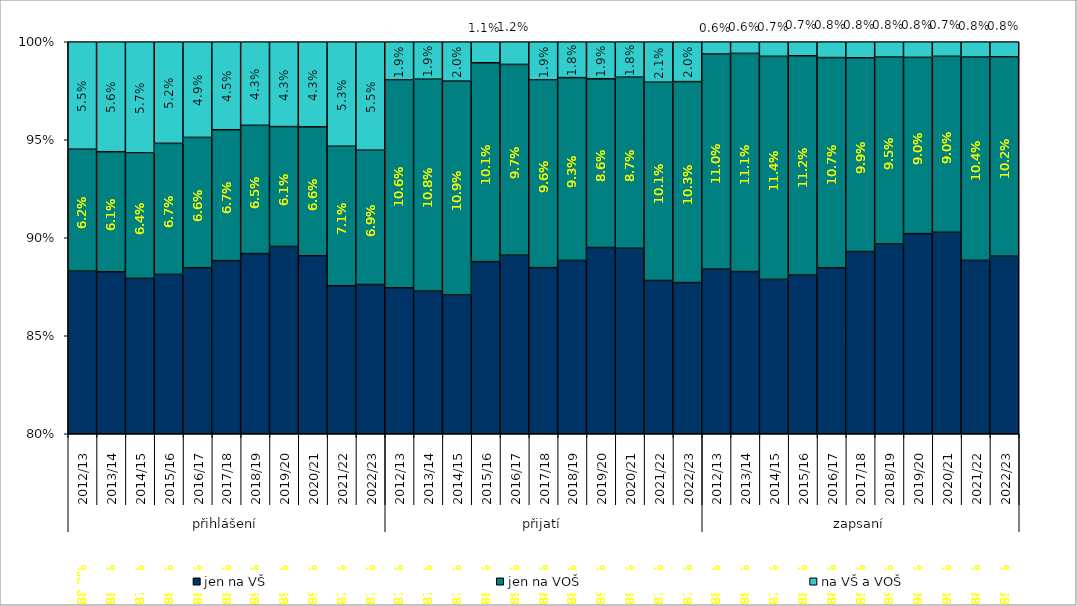
| Category | jen na VŠ | jen na VOŠ | na VŠ a VOŠ |
|---|---|---|---|
| 0 | 0.883 | 0.062 | 0.055 |
| 1 | 0.883 | 0.061 | 0.056 |
| 2 | 0.879 | 0.064 | 0.057 |
| 3 | 0.881 | 0.067 | 0.052 |
| 4 | 0.885 | 0.066 | 0.049 |
| 5 | 0.888 | 0.067 | 0.045 |
| 6 | 0.892 | 0.065 | 0.043 |
| 7 | 0.896 | 0.061 | 0.043 |
| 8 | 0.891 | 0.066 | 0.043 |
| 9 | 0.876 | 0.071 | 0.053 |
| 10 | 0.876 | 0.069 | 0.055 |
| 11 | 0.874 | 0.106 | 0.019 |
| 12 | 0.873 | 0.108 | 0.019 |
| 13 | 0.871 | 0.109 | 0.02 |
| 14 | 0.888 | 0.101 | 0.011 |
| 15 | 0.891 | 0.097 | 0.012 |
| 16 | 0.885 | 0.096 | 0.019 |
| 17 | 0.888 | 0.093 | 0.018 |
| 18 | 0.895 | 0.086 | 0.019 |
| 19 | 0.895 | 0.087 | 0.018 |
| 20 | 0.878 | 0.101 | 0.021 |
| 21 | 0.877 | 0.103 | 0.02 |
| 22 | 0.884 | 0.11 | 0.006 |
| 23 | 0.883 | 0.111 | 0.006 |
| 24 | 0.879 | 0.114 | 0.007 |
| 25 | 0.881 | 0.112 | 0.007 |
| 26 | 0.885 | 0.107 | 0.008 |
| 27 | 0.893 | 0.099 | 0.008 |
| 28 | 0.897 | 0.095 | 0.008 |
| 29 | 0.902 | 0.09 | 0.008 |
| 30 | 0.903 | 0.09 | 0.007 |
| 31 | 0.888 | 0.104 | 0.008 |
| 32 | 0.891 | 0.102 | 0.008 |